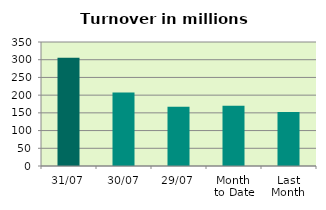
| Category | Series 0 |
|---|---|
| 31/07 | 305.385 |
| 30/07 | 207.198 |
| 29/07 | 167.041 |
| Month 
to Date | 170.387 |
| Last
Month | 152.535 |